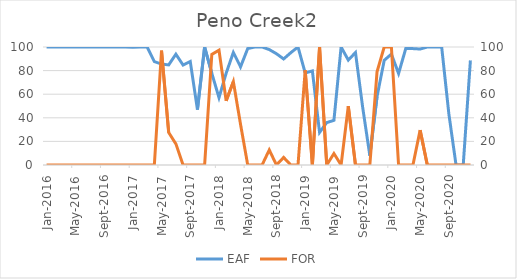
| Category | EAF |
|---|---|
| 2016-01-01 | 100 |
| 2016-02-01 | 100 |
| 2016-03-01 | 100 |
| 2016-04-01 | 100 |
| 2016-05-01 | 100 |
| 2016-06-01 | 100 |
| 2016-07-01 | 100 |
| 2016-08-01 | 100 |
| 2016-09-01 | 100 |
| 2016-10-01 | 100 |
| 2016-11-01 | 100 |
| 2016-12-01 | 100 |
| 2017-01-01 | 99.8 |
| 2017-02-01 | 100 |
| 2017-03-01 | 100 |
| 2017-04-01 | 87.64 |
| 2017-05-01 | 85.51 |
| 2017-06-01 | 84.84 |
| 2017-07-01 | 93.93 |
| 2017-08-01 | 84.67 |
| 2017-09-01 | 87.78 |
| 2017-10-01 | 46.92 |
| 2017-11-01 | 100 |
| 2017-12-01 | 77.68 |
| 2018-01-01 | 57.06 |
| 2018-02-01 | 77.82 |
| 2018-03-01 | 95.38 |
| 2018-04-01 | 83.18 |
| 2018-05-01 | 98.69 |
| 2018-06-01 | 100 |
| 2018-07-01 | 100 |
| 2018-08-01 | 97.82 |
| 2018-09-01 | 94.3 |
| 2018-10-01 | 89.86 |
| 2018-11-01 | 95.21 |
| 2018-12-01 | 100 |
| 2019-01-01 | 78 |
| 2019-02-01 | 79.73 |
| 2019-03-01 | 27.6 |
| 2019-04-01 | 35.95 |
| 2019-05-01 | 37.84 |
| 2019-06-01 | 100 |
| 2019-07-01 | 88.92 |
| 2019-08-01 | 95.32 |
| 2019-09-01 | 48.98 |
| 2019-10-01 | 7.91 |
| 2019-11-01 | 57.98 |
| 2019-12-01 | 88.69 |
| 2020-01-01 | 94 |
| 2020-02-01 | 77.55 |
| 2020-03-01 | 98.66 |
| 2020-04-01 | 98.64 |
| 2020-05-01 | 98.27 |
| 2020-06-01 | 100 |
| 2020-07-01 | 100 |
| 2020-08-01 | 100 |
| 2020-09-01 | 43.33 |
| 2020-10-01 | 0 |
| 2020-11-01 | 0 |
| 2020-12-01 | 88.63 |